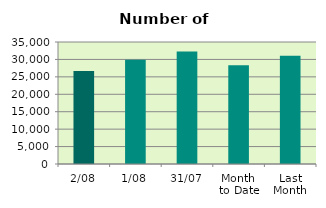
| Category | Series 0 |
|---|---|
| 2/08 | 26690 |
| 1/08 | 29920 |
| 31/07 | 32258 |
| Month 
to Date | 28305 |
| Last
Month | 31061.545 |